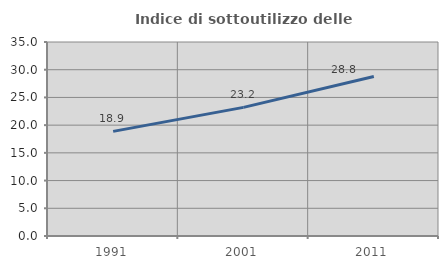
| Category | Indice di sottoutilizzo delle abitazioni  |
|---|---|
| 1991.0 | 18.88 |
| 2001.0 | 23.209 |
| 2011.0 | 28.763 |